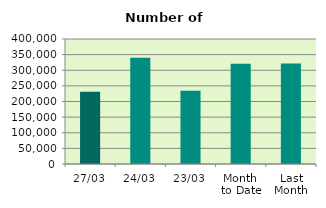
| Category | Series 0 |
|---|---|
| 27/03 | 231226 |
| 24/03 | 340326 |
| 23/03 | 234352 |
| Month 
to Date | 320754.632 |
| Last
Month | 321374.6 |